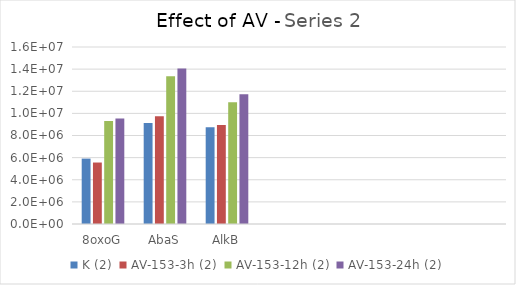
| Category | K (2) | AV-153-3h (2) | AV-153-12h (2) | AV-153-24h (2) |
|---|---|---|---|---|
| 8oxoG | 5911221.5 | 5556934 | 9316007.5 | 9528403.5 |
| AbaS | 9135183.5 | 9748562.5 | 13355985 | 14054685.5 |
| AlkB | 8747237 | 8959008.5 | 11003293.5 | 11739341.5 |